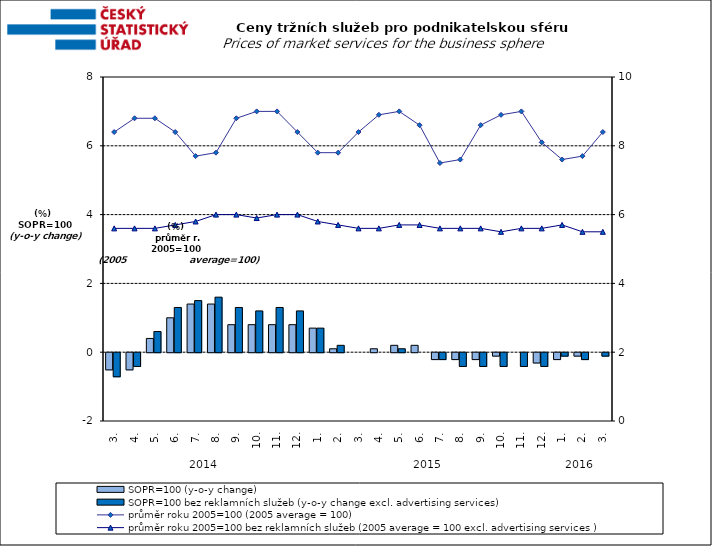
| Category | SOPR=100 (y-o-y change)   | SOPR=100 bez reklamních služeb (y-o-y change excl. advertising services)   |
|---|---|---|
| 0 | -0.5 | -0.7 |
| 1 | -0.5 | -0.4 |
| 2 | 0.4 | 0.6 |
| 3 | 1 | 1.3 |
| 4 | 1.4 | 1.5 |
| 5 | 1.4 | 1.6 |
| 6 | 0.8 | 1.3 |
| 7 | 0.8 | 1.2 |
| 8 | 0.8 | 1.3 |
| 9 | 0.8 | 1.2 |
| 10 | 0.7 | 0.7 |
| 11 | 0.1 | 0.2 |
| 12 | 0 | 0 |
| 13 | 0.1 | 0 |
| 14 | 0.2 | 0.1 |
| 15 | 0.2 | 0 |
| 16 | -0.2 | -0.2 |
| 17 | -0.2 | -0.4 |
| 18 | -0.2 | -0.4 |
| 19 | -0.1 | -0.4 |
| 20 | 0 | -0.4 |
| 21 | -0.3 | -0.4 |
| 22 | -0.2 | -0.1 |
| 23 | -0.1 | -0.2 |
| 24 | 0 | -0.1 |